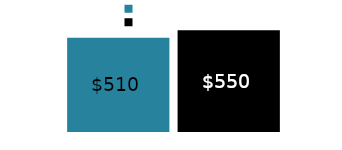
| Category | coming in | going out |
|---|---|---|
| Money coming in: | 510 | 550 |